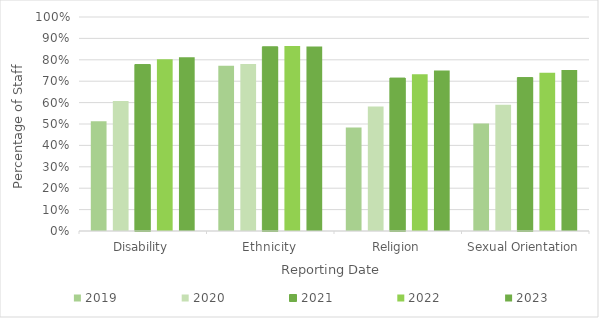
| Category | 2018 | 2019 | 2020 | 2021 | 2022 | 2023 |
|---|---|---|---|---|---|---|
| Disability |  | 0.513 | 0.607 | 0.778 | 0.802 | 0.812 |
| Ethnicity |  | 0.772 | 0.781 | 0.861 | 0.864 | 0.862 |
| Religion |  | 0.483 | 0.581 | 0.715 | 0.732 | 0.75 |
| Sexual Orientation |  | 0.502 | 0.59 | 0.717 | 0.74 | 0.752 |